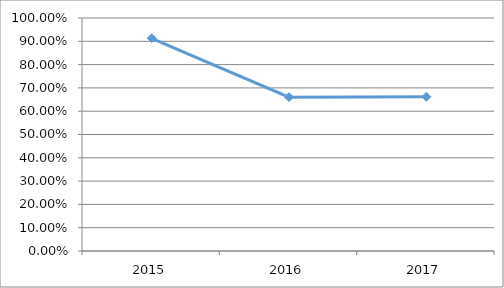
| Category | CIMA-F2O02 |
|---|---|
| 2015.0 | 0.913 |
| 2016.0 | 0.66 |
| 2017.0 | 0.662 |